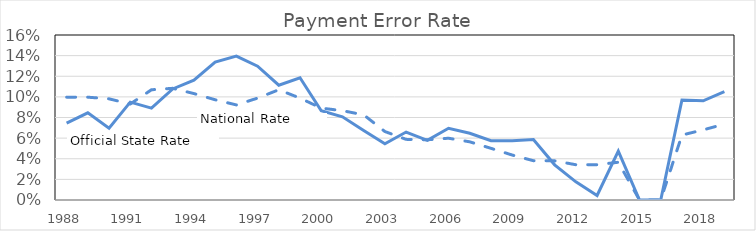
| Category | Series 1 | Series 2 |
|---|---|---|
| 1988.0 | 0.074 | 0.1 |
| 1989.0 | 0.084 | 0.1 |
| 1990.0 | 0.07 | 0.098 |
| 1991.0 | 0.095 | 0.093 |
| 1992.0 | 0.089 | 0.107 |
| 1993.0 | 0.108 | 0.108 |
| 1994.0 | 0.116 | 0.103 |
| 1995.0 | 0.134 | 0.097 |
| 1996.0 | 0.14 | 0.092 |
| 1997.0 | 0.13 | 0.099 |
| 1998.0 | 0.111 | 0.107 |
| 1999.0 | 0.118 | 0.099 |
| 2000.0 | 0.087 | 0.089 |
| 2001.0 | 0.081 | 0.087 |
| 2002.0 | 0.067 | 0.083 |
| 2003.0 | 0.055 | 0.066 |
| 2004.0 | 0.066 | 0.059 |
| 2005.0 | 0.058 | 0.058 |
| 2006.0 | 0.07 | 0.06 |
| 2007.0 | 0.065 | 0.056 |
| 2008.0 | 0.058 | 0.05 |
| 2009.0 | 0.057 | 0.044 |
| 2010.0 | 0.059 | 0.038 |
| 2011.0 | 0.034 | 0.038 |
| 2012.0 | 0.018 | 0.034 |
| 2013.0 | 0.004 | 0.034 |
| 2014.0 | 0.047 | 0.037 |
| 2015.0 | 0 | 0 |
| 2016.0 | 0 | 0 |
| 2017.0 | 0.097 | 0.063 |
| 2018.0 | 0.096 | 0.068 |
| 2019.0 | 0.105 | 0.074 |